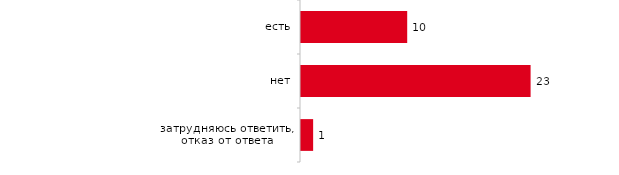
| Category | Series 0 |
|---|---|
| есть | 10.453 |
| нет | 22.598 |
| затрудняюсь ответить, отказ от ответа | 1.195 |